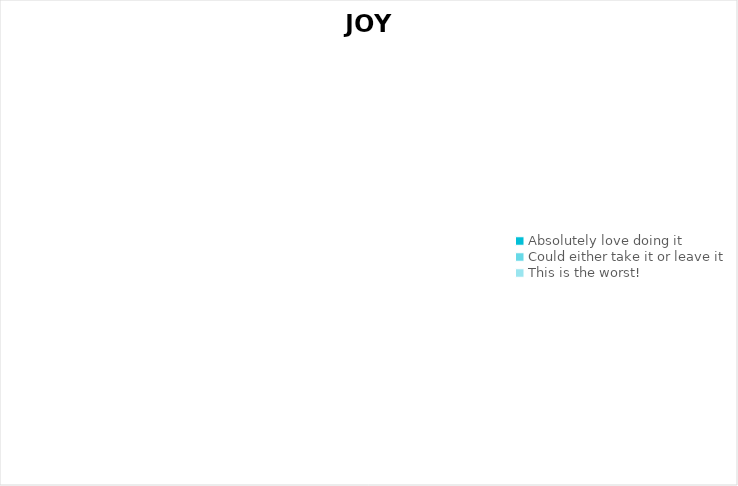
| Category | Series 0 |
|---|---|
| Absolutely love doing it | 0 |
| Could either take it or leave it | 0 |
| This is the worst! | 0 |